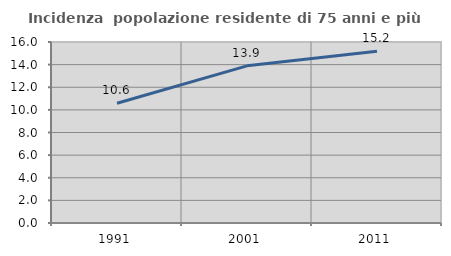
| Category | Incidenza  popolazione residente di 75 anni e più |
|---|---|
| 1991.0 | 10.591 |
| 2001.0 | 13.891 |
| 2011.0 | 15.176 |